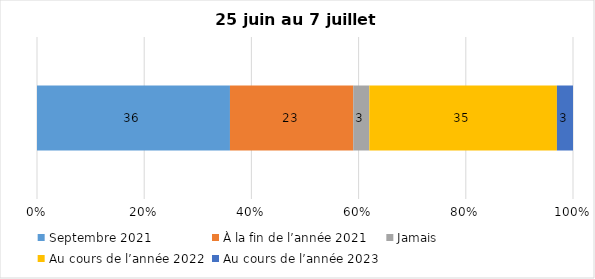
| Category | Septembre 2021 | À la fin de l’année 2021 | Jamais | Au cours de l’année 2022 | Au cours de l’année 2023 |
|---|---|---|---|---|---|
| 0 | 36 | 23 | 3 | 35 | 3 |